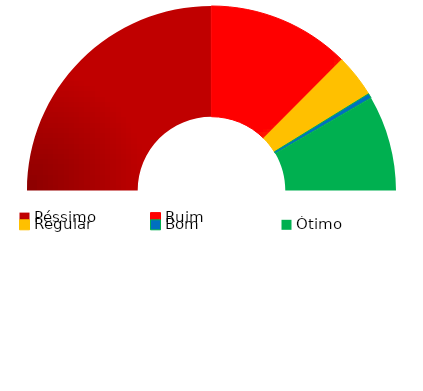
| Category | Categoria |
|---|---|
| Oculto (ΣAMP) | 1.201 |
| Péssimo | 0.6 |
| Ruim | 0.3 |
| Regular | 0.09 |
| Bom | 0.01 |
| Ótimo | 0.201 |